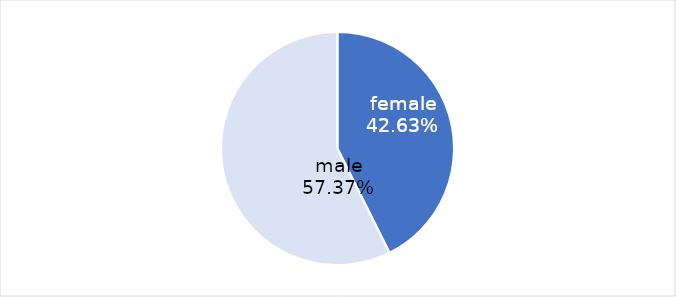
| Category | Series 0 |
|---|---|
| female | 159 |
| male | 214 |